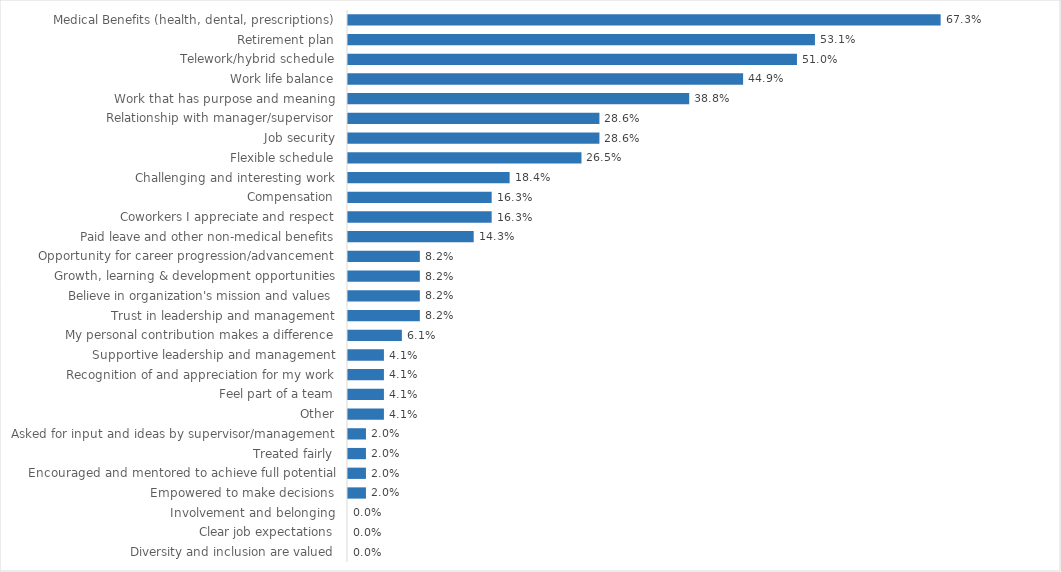
| Category | Public Service Department |
|---|---|
| Medical Benefits (health, dental, prescriptions) | 0.673 |
| Retirement plan | 0.531 |
| Telework/hybrid schedule | 0.51 |
| Work life balance | 0.449 |
| Work that has purpose and meaning | 0.388 |
| Relationship with manager/supervisor | 0.286 |
| Job security | 0.286 |
| Flexible schedule | 0.265 |
| Challenging and interesting work | 0.184 |
| Compensation | 0.163 |
| Coworkers I appreciate and respect | 0.163 |
| Paid leave and other non-medical benefits | 0.143 |
| Opportunity for career progression/advancement | 0.082 |
| Growth, learning & development opportunities | 0.082 |
| Believe in organization's mission and values | 0.082 |
| Trust in leadership and management | 0.082 |
| My personal contribution makes a difference | 0.061 |
| Supportive leadership and management | 0.041 |
| Recognition of and appreciation for my work | 0.041 |
| Feel part of a team | 0.041 |
| Other | 0.041 |
| Asked for input and ideas by supervisor/management | 0.02 |
| Treated fairly | 0.02 |
| Encouraged and mentored to achieve full potential | 0.02 |
| Empowered to make decisions | 0.02 |
| Involvement and belonging | 0 |
| Clear job expectations | 0 |
| Diversity and inclusion are valued | 0 |